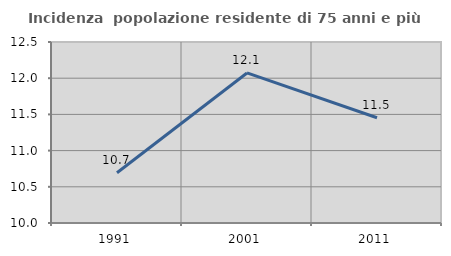
| Category | Incidenza  popolazione residente di 75 anni e più |
|---|---|
| 1991.0 | 10.694 |
| 2001.0 | 12.072 |
| 2011.0 | 11.454 |